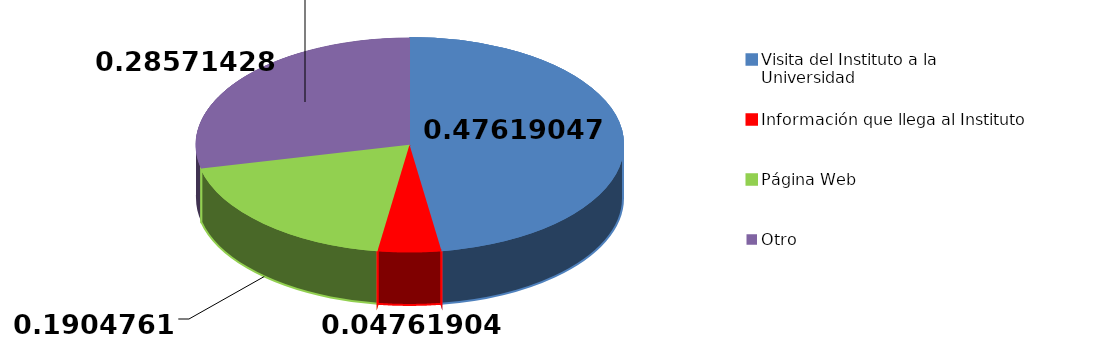
| Category | Frecuencia | Series 1 |
|---|---|---|
| Visita del Instituto a la Universidad | 10 | 96 |
| Información que llega al Instituto | 1 | 97 |
| Página Web | 4 | 98 |
| Otro | 6 | 99 |